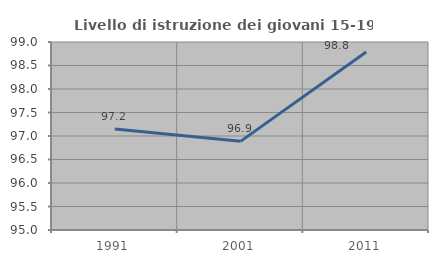
| Category | Livello di istruzione dei giovani 15-19 anni |
|---|---|
| 1991.0 | 97.151 |
| 2001.0 | 96.886 |
| 2011.0 | 98.785 |